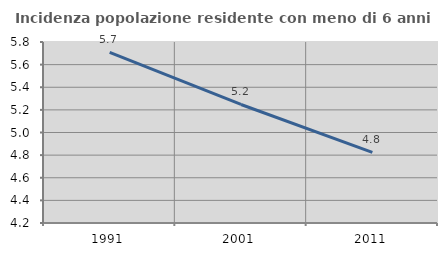
| Category | Incidenza popolazione residente con meno di 6 anni |
|---|---|
| 1991.0 | 5.708 |
| 2001.0 | 5.248 |
| 2011.0 | 4.824 |